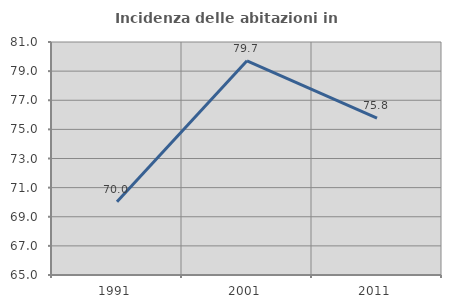
| Category | Incidenza delle abitazioni in proprietà  |
|---|---|
| 1991.0 | 70.033 |
| 2001.0 | 79.705 |
| 2011.0 | 75.777 |